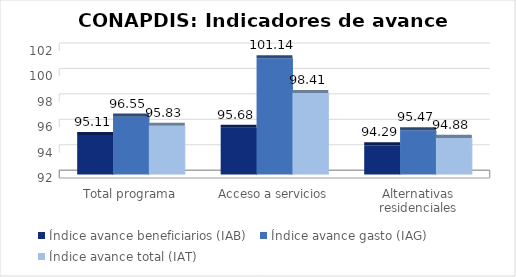
| Category | Índice avance beneficiarios (IAB)  | Índice avance gasto (IAG) | Índice avance total (IAT)  |
|---|---|---|---|
| Total programa | 95.109 | 96.554 | 95.832 |
| Acceso a servicios | 95.681 | 101.142 | 98.411 |
| Alternativas residenciales | 94.288 | 95.465 | 94.876 |